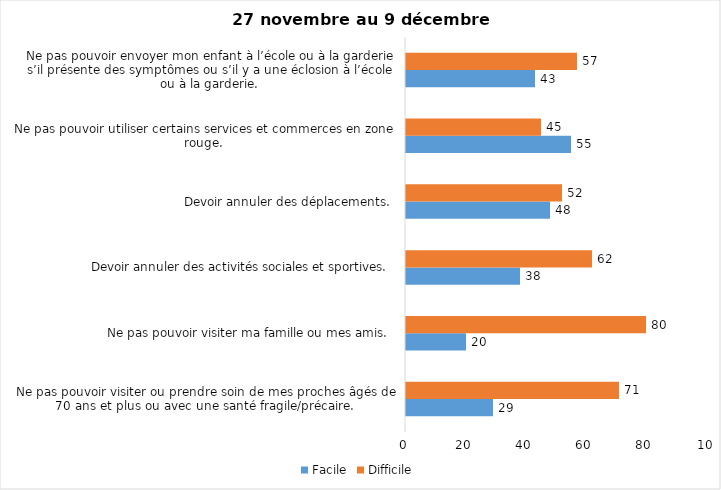
| Category | Facile | Difficile |
|---|---|---|
| Ne pas pouvoir visiter ou prendre soin de mes proches âgés de 70 ans et plus ou avec une santé fragile/précaire.  | 29 | 71 |
| Ne pas pouvoir visiter ma famille ou mes amis.  | 20 | 80 |
| Devoir annuler des activités sociales et sportives.  | 38 | 62 |
| Devoir annuler des déplacements.  | 48 | 52 |
| Ne pas pouvoir utiliser certains services et commerces en zone rouge.  | 55 | 45 |
| Ne pas pouvoir envoyer mon enfant à l’école ou à la garderie s’il présente des symptômes ou s’il y a une éclosion à l’école ou à la garderie.  | 43 | 57 |